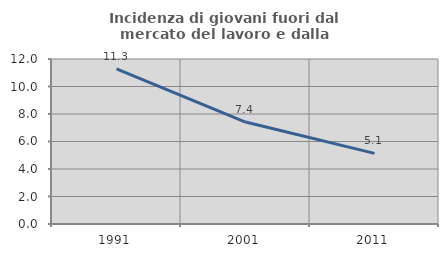
| Category | Incidenza di giovani fuori dal mercato del lavoro e dalla formazione  |
|---|---|
| 1991.0 | 11.275 |
| 2001.0 | 7.415 |
| 2011.0 | 5.137 |